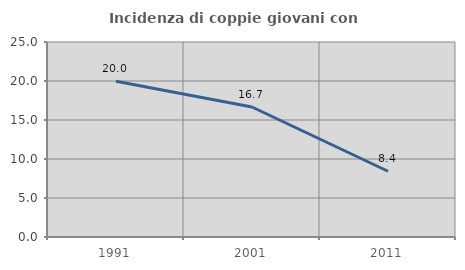
| Category | Incidenza di coppie giovani con figli |
|---|---|
| 1991.0 | 19.963 |
| 2001.0 | 16.667 |
| 2011.0 | 8.432 |